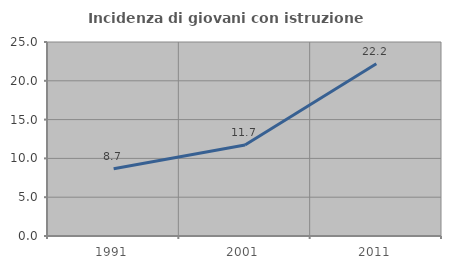
| Category | Incidenza di giovani con istruzione universitaria |
|---|---|
| 1991.0 | 8.678 |
| 2001.0 | 11.736 |
| 2011.0 | 22.206 |